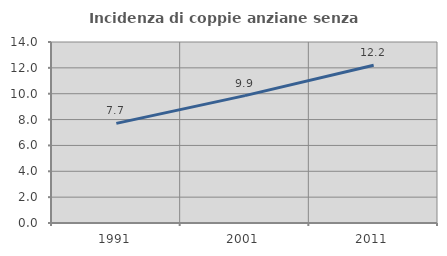
| Category | Incidenza di coppie anziane senza figli  |
|---|---|
| 1991.0 | 7.708 |
| 2001.0 | 9.854 |
| 2011.0 | 12.197 |